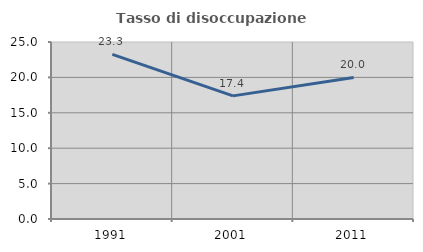
| Category | Tasso di disoccupazione giovanile  |
|---|---|
| 1991.0 | 23.256 |
| 2001.0 | 17.391 |
| 2011.0 | 20 |